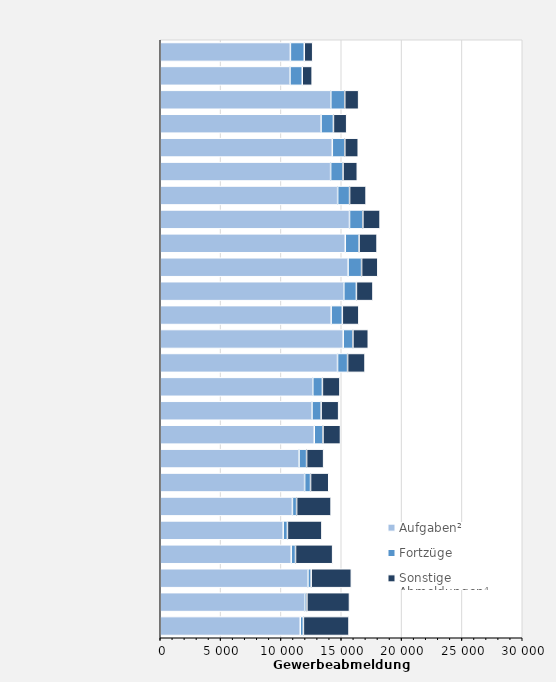
| Category | Aufgaben² | Fortzüge | Sonstige Abmeldungen⁴ |
|---|---|---|---|
| 1997.0 | 11603 | 259 | 3782 |
| 1998.0 | 11976 | 177 | 3529 |
| 1999.0 | 12240 | 268 | 3326 |
| 2000.0 | 10853 | 356 | 3078 |
| 2001.0 | 10187 | 351 | 2860 |
| 2002.0 | 10953 | 348 | 2857 |
| 2003.0 | 11965 | 490 | 1509 |
| 2004.0 | 11504 | 625 | 1411 |
| 2005.0 | 12763 | 724 | 1449 |
| 2006.0 | 12576 | 755 | 1454 |
| 2007.0 | 12642 | 796 | 1452 |
| 2008.0 | 14693 | 834 | 1445 |
| 2009.0 | 15163 | 805 | 1272 |
| 2010.0 | 14163 | 926 | 1371 |
| 2011.0 | 15213 | 1043 | 1373 |
| 2012.0 | 15567 | 1119 | 1346 |
| 2013.0 | 15333 | 1147 | 1488 |
| 2014.0 | 15684 | 1109 | 1426 |
| 2015.0 | 14703 | 988 | 1367 |
| 2016.0 | 14120 | 1028 | 1181 |
| 2017.0 | 14259 | 1036 | 1112 |
| 2018.0 | 13328 | 1024 | 1098 |
| 2019.0 | 14135 | 1155 | 1151 |
| 2020.0 | 10752 | 1017 | 820 |
| 2021.0 | 10784 | 1151 | 699 |